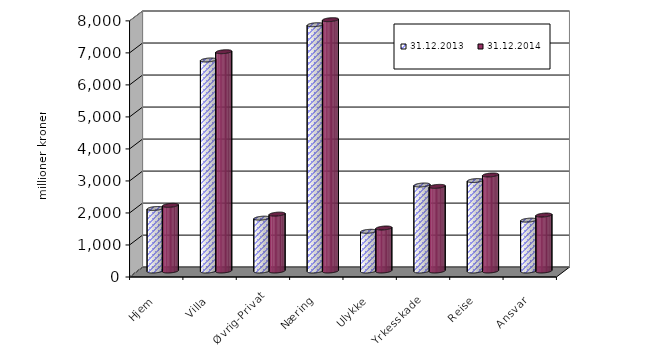
| Category | 31.12.2013 | 31.12.2014 |
|---|---|---|
| Hjem | 1952.77 | 2050.098 |
| Villa | 6591.074 | 6849.368 |
| Øvrig-Privat | 1650.752 | 1777.174 |
| Næring | 7692.706 | 7850.181 |
| Ulykke | 1240.185 | 1343.033 |
| Yrkesskade | 2686.194 | 2643.795 |
| Reise | 2825.281 | 2999.816 |
| Ansvar | 1589.018 | 1747.777 |